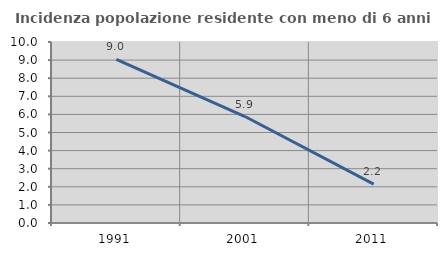
| Category | Incidenza popolazione residente con meno di 6 anni |
|---|---|
| 1991.0 | 9.045 |
| 2001.0 | 5.882 |
| 2011.0 | 2.151 |